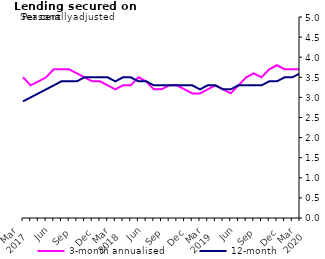
| Category | 3-month annualised | 12-month |
|---|---|---|
| Mar 
2017 | 3.5 | 2.9 |
|  | 3.3 | 3 |
|  | 3.4 | 3.1 |
| Jun | 3.5 | 3.2 |
|  | 3.7 | 3.3 |
|  | 3.7 | 3.4 |
| Sep | 3.7 | 3.4 |
|  | 3.6 | 3.4 |
|  | 3.5 | 3.5 |
| Dec | 3.4 | 3.5 |
|  | 3.4 | 3.5 |
|  | 3.3 | 3.5 |
| Mar 
2018 | 3.2 | 3.4 |
|  | 3.3 | 3.5 |
|  | 3.3 | 3.5 |
| Jun | 3.5 | 3.4 |
|  | 3.4 | 3.4 |
|  | 3.2 | 3.3 |
| Sep | 3.2 | 3.3 |
|  | 3.3 | 3.3 |
|  | 3.3 | 3.3 |
| Dec | 3.2 | 3.3 |
|  | 3.1 | 3.3 |
|  | 3.1 | 3.2 |
| Mar 
2019 | 3.2 | 3.3 |
|  | 3.3 | 3.3 |
|  | 3.2 | 3.2 |
| Jun | 3.1 | 3.2 |
|  | 3.3 | 3.3 |
|  | 3.5 | 3.3 |
| Sep | 3.6 | 3.3 |
|  | 3.5 | 3.3 |
|  | 3.7 | 3.4 |
| Dec | 3.8 | 3.4 |
|  | 3.7 | 3.5 |
|  | 3.7 | 3.5 |
| Mar 
2020 | 3.7 | 3.6 |